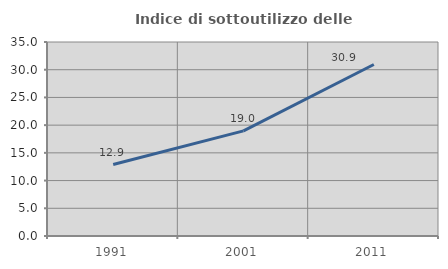
| Category | Indice di sottoutilizzo delle abitazioni  |
|---|---|
| 1991.0 | 12.886 |
| 2001.0 | 18.97 |
| 2011.0 | 30.934 |